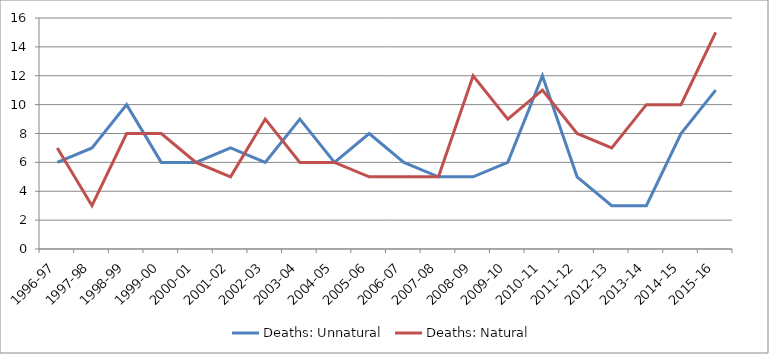
| Category | Deaths: Unnatural | Deaths: Natural |
|---|---|---|
| 1996-97 | 6 | 7 |
| 1997-98 | 7 | 3 |
| 1998-99 | 10 | 8 |
| 1999-00 | 6 | 8 |
| 2000-01 | 6 | 6 |
| 2001-02 | 7 | 5 |
| 2002-03 | 6 | 9 |
| 2003-04 | 9 | 6 |
| 2004-05 | 6 | 6 |
| 2005-06 | 8 | 5 |
| 2006-07 | 6 | 5 |
| 2007-08 | 5 | 5 |
| 2008-09 | 5 | 12 |
| 2009-10 | 6 | 9 |
| 2010-11 | 12 | 11 |
| 2011-12 | 5 | 8 |
| 2012-13 | 3 | 7 |
| 2013-14 | 3 | 10 |
| 2014-15 | 8 | 10 |
| 2015-16 | 11 | 15 |